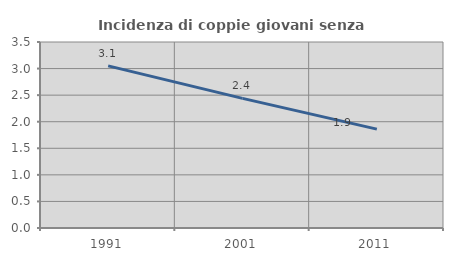
| Category | Incidenza di coppie giovani senza figli |
|---|---|
| 1991.0 | 3.051 |
| 2001.0 | 2.439 |
| 2011.0 | 1.86 |